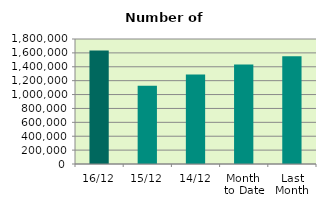
| Category | Series 0 |
|---|---|
| 16/12 | 1632934 |
| 15/12 | 1127276 |
| 14/12 | 1290176 |
| Month 
to Date | 1434251.833 |
| Last
Month | 1553278.182 |